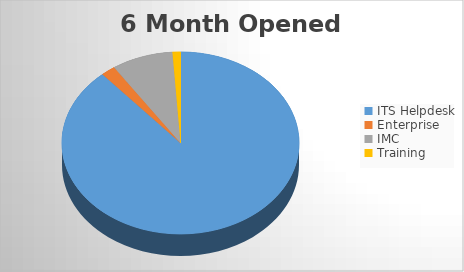
| Category | 6M Opened |
|---|---|
| ITS Helpdesk | 2030 |
| Enterprise | 45 |
| IMC | 192 |
| Training | 25 |